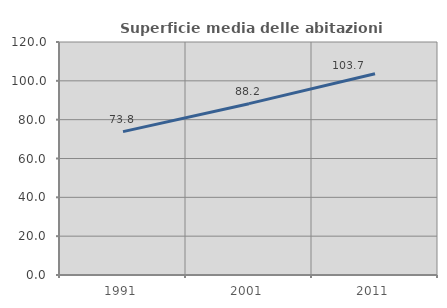
| Category | Superficie media delle abitazioni occupate |
|---|---|
| 1991.0 | 73.837 |
| 2001.0 | 88.242 |
| 2011.0 | 103.662 |